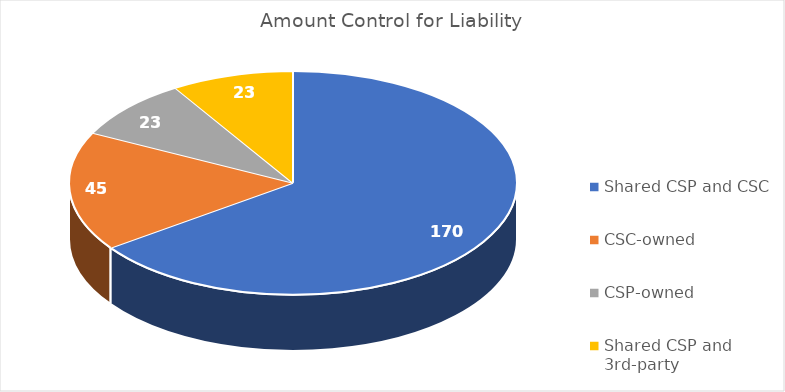
| Category | Total |
|---|---|
| Shared CSP and CSC | 170 |
| CSC-owned | 45 |
| CSP-owned | 23 |
| Shared CSP and 3rd-party | 23 |